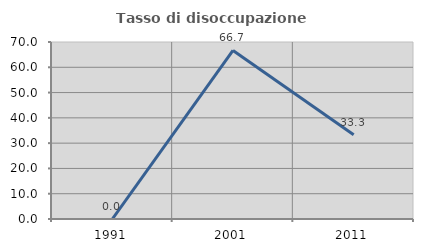
| Category | Tasso di disoccupazione giovanile  |
|---|---|
| 1991.0 | 0 |
| 2001.0 | 66.667 |
| 2011.0 | 33.333 |